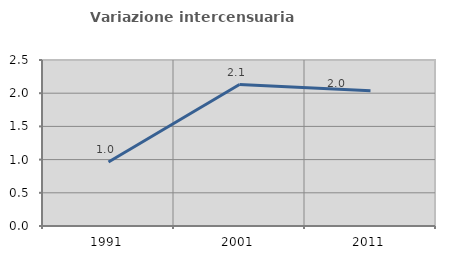
| Category | Variazione intercensuaria annua |
|---|---|
| 1991.0 | 0.963 |
| 2001.0 | 2.131 |
| 2011.0 | 2.036 |